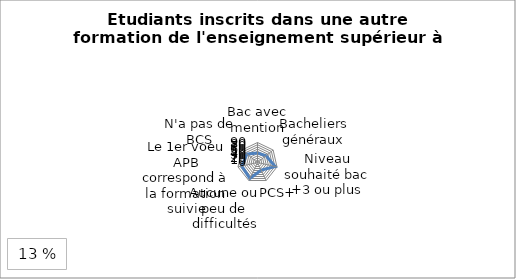
| Category | Etudiants inscrits dans une autre formation de l'enseignement supérieur à la rentrée 2017 |
|---|---|
| Bac avec mention | 42.7 |
| Bacheliers généraux | 48.9 |
| Niveau souhaité bac +3 ou plus | 81.5 |
| PCS+ | 38.1 |
| Aucune ou peu de difficultés | 79.6 |
| Le 1er voeu APB correspond à la formation suivie | 72.6 |
| N'a pas de BCS | 60.9 |